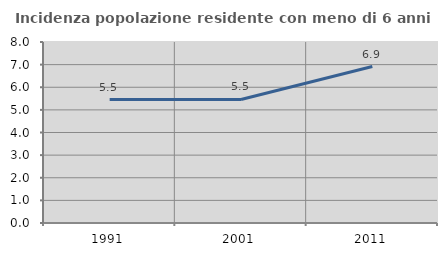
| Category | Incidenza popolazione residente con meno di 6 anni |
|---|---|
| 1991.0 | 5.455 |
| 2001.0 | 5.459 |
| 2011.0 | 6.916 |